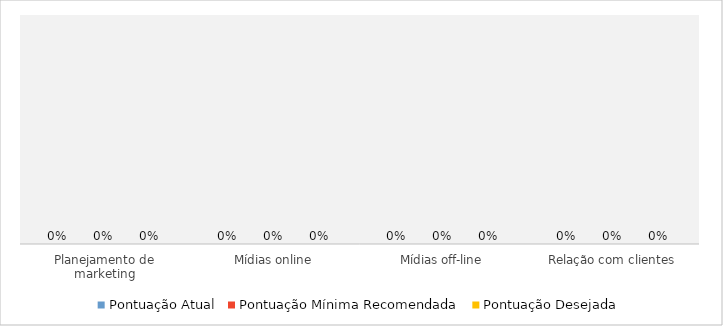
| Category | Pontuação Atual | Pontuação Mínima Recomendada | Pontuação Desejada |
|---|---|---|---|
| Planejamento de marketing | 0 | 0 | 0 |
| Mídias online | 0 | 0 | 0 |
| Mídias off-line | 0 | 0 | 0 |
| Relação com clientes | 0 | 0 | 0 |